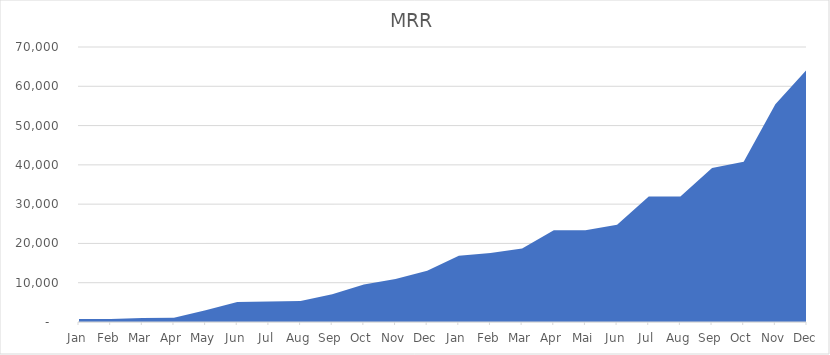
| Category | MRR |
|---|---|
| Jan | 761.1 |
| Feb | 761.1 |
| Mar | 1007.72 |
| Apr | 1100.94 |
| May | 3000 |
| Jun | 5074 |
| Jul | 5226.22 |
| Aug | 5354.84 |
| Sep | 7035.16 |
| Oct | 9570.98 |
| Nov | 10929.16 |
| Dec | 13016.58 |
| Jan | 16878.72 |
| Feb | 17567.84 |
| Mar | 18732.5 |
| Apr | 23356.92 |
| Mai | 23356.92 |
| Jun | 24780 |
| Jul | 31920 |
| Aug | 31920 |
| Sep | 39206.88 |
| Oct | 40802.88 |
| Nov | 55441.016 |
| Dec | 64308.278 |